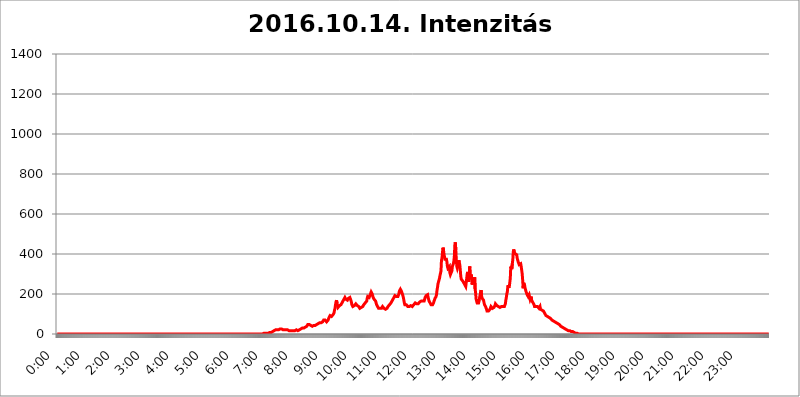
| Category | 2016.10.14. Intenzitás [W/m^2] |
|---|---|
| 0.0 | 0 |
| 0.0006944444444444445 | 0 |
| 0.001388888888888889 | 0 |
| 0.0020833333333333333 | 0 |
| 0.002777777777777778 | 0 |
| 0.003472222222222222 | 0 |
| 0.004166666666666667 | 0 |
| 0.004861111111111111 | 0 |
| 0.005555555555555556 | 0 |
| 0.0062499999999999995 | 0 |
| 0.006944444444444444 | 0 |
| 0.007638888888888889 | 0 |
| 0.008333333333333333 | 0 |
| 0.009027777777777779 | 0 |
| 0.009722222222222222 | 0 |
| 0.010416666666666666 | 0 |
| 0.011111111111111112 | 0 |
| 0.011805555555555555 | 0 |
| 0.012499999999999999 | 0 |
| 0.013194444444444444 | 0 |
| 0.013888888888888888 | 0 |
| 0.014583333333333332 | 0 |
| 0.015277777777777777 | 0 |
| 0.015972222222222224 | 0 |
| 0.016666666666666666 | 0 |
| 0.017361111111111112 | 0 |
| 0.018055555555555557 | 0 |
| 0.01875 | 0 |
| 0.019444444444444445 | 0 |
| 0.02013888888888889 | 0 |
| 0.020833333333333332 | 0 |
| 0.02152777777777778 | 0 |
| 0.022222222222222223 | 0 |
| 0.02291666666666667 | 0 |
| 0.02361111111111111 | 0 |
| 0.024305555555555556 | 0 |
| 0.024999999999999998 | 0 |
| 0.025694444444444447 | 0 |
| 0.02638888888888889 | 0 |
| 0.027083333333333334 | 0 |
| 0.027777777777777776 | 0 |
| 0.02847222222222222 | 0 |
| 0.029166666666666664 | 0 |
| 0.029861111111111113 | 0 |
| 0.030555555555555555 | 0 |
| 0.03125 | 0 |
| 0.03194444444444445 | 0 |
| 0.03263888888888889 | 0 |
| 0.03333333333333333 | 0 |
| 0.034027777777777775 | 0 |
| 0.034722222222222224 | 0 |
| 0.035416666666666666 | 0 |
| 0.036111111111111115 | 0 |
| 0.03680555555555556 | 0 |
| 0.0375 | 0 |
| 0.03819444444444444 | 0 |
| 0.03888888888888889 | 0 |
| 0.03958333333333333 | 0 |
| 0.04027777777777778 | 0 |
| 0.04097222222222222 | 0 |
| 0.041666666666666664 | 0 |
| 0.042361111111111106 | 0 |
| 0.04305555555555556 | 0 |
| 0.043750000000000004 | 0 |
| 0.044444444444444446 | 0 |
| 0.04513888888888889 | 0 |
| 0.04583333333333334 | 0 |
| 0.04652777777777778 | 0 |
| 0.04722222222222222 | 0 |
| 0.04791666666666666 | 0 |
| 0.04861111111111111 | 0 |
| 0.049305555555555554 | 0 |
| 0.049999999999999996 | 0 |
| 0.05069444444444445 | 0 |
| 0.051388888888888894 | 0 |
| 0.052083333333333336 | 0 |
| 0.05277777777777778 | 0 |
| 0.05347222222222222 | 0 |
| 0.05416666666666667 | 0 |
| 0.05486111111111111 | 0 |
| 0.05555555555555555 | 0 |
| 0.05625 | 0 |
| 0.05694444444444444 | 0 |
| 0.057638888888888885 | 0 |
| 0.05833333333333333 | 0 |
| 0.05902777777777778 | 0 |
| 0.059722222222222225 | 0 |
| 0.06041666666666667 | 0 |
| 0.061111111111111116 | 0 |
| 0.06180555555555556 | 0 |
| 0.0625 | 0 |
| 0.06319444444444444 | 0 |
| 0.06388888888888888 | 0 |
| 0.06458333333333334 | 0 |
| 0.06527777777777778 | 0 |
| 0.06597222222222222 | 0 |
| 0.06666666666666667 | 0 |
| 0.06736111111111111 | 0 |
| 0.06805555555555555 | 0 |
| 0.06874999999999999 | 0 |
| 0.06944444444444443 | 0 |
| 0.07013888888888889 | 0 |
| 0.07083333333333333 | 0 |
| 0.07152777777777779 | 0 |
| 0.07222222222222223 | 0 |
| 0.07291666666666667 | 0 |
| 0.07361111111111111 | 0 |
| 0.07430555555555556 | 0 |
| 0.075 | 0 |
| 0.07569444444444444 | 0 |
| 0.0763888888888889 | 0 |
| 0.07708333333333334 | 0 |
| 0.07777777777777778 | 0 |
| 0.07847222222222222 | 0 |
| 0.07916666666666666 | 0 |
| 0.0798611111111111 | 0 |
| 0.08055555555555556 | 0 |
| 0.08125 | 0 |
| 0.08194444444444444 | 0 |
| 0.08263888888888889 | 0 |
| 0.08333333333333333 | 0 |
| 0.08402777777777777 | 0 |
| 0.08472222222222221 | 0 |
| 0.08541666666666665 | 0 |
| 0.08611111111111112 | 0 |
| 0.08680555555555557 | 0 |
| 0.08750000000000001 | 0 |
| 0.08819444444444445 | 0 |
| 0.08888888888888889 | 0 |
| 0.08958333333333333 | 0 |
| 0.09027777777777778 | 0 |
| 0.09097222222222222 | 0 |
| 0.09166666666666667 | 0 |
| 0.09236111111111112 | 0 |
| 0.09305555555555556 | 0 |
| 0.09375 | 0 |
| 0.09444444444444444 | 0 |
| 0.09513888888888888 | 0 |
| 0.09583333333333333 | 0 |
| 0.09652777777777777 | 0 |
| 0.09722222222222222 | 0 |
| 0.09791666666666667 | 0 |
| 0.09861111111111111 | 0 |
| 0.09930555555555555 | 0 |
| 0.09999999999999999 | 0 |
| 0.10069444444444443 | 0 |
| 0.1013888888888889 | 0 |
| 0.10208333333333335 | 0 |
| 0.10277777777777779 | 0 |
| 0.10347222222222223 | 0 |
| 0.10416666666666667 | 0 |
| 0.10486111111111111 | 0 |
| 0.10555555555555556 | 0 |
| 0.10625 | 0 |
| 0.10694444444444444 | 0 |
| 0.1076388888888889 | 0 |
| 0.10833333333333334 | 0 |
| 0.10902777777777778 | 0 |
| 0.10972222222222222 | 0 |
| 0.1111111111111111 | 0 |
| 0.11180555555555556 | 0 |
| 0.11180555555555556 | 0 |
| 0.1125 | 0 |
| 0.11319444444444444 | 0 |
| 0.11388888888888889 | 0 |
| 0.11458333333333333 | 0 |
| 0.11527777777777777 | 0 |
| 0.11597222222222221 | 0 |
| 0.11666666666666665 | 0 |
| 0.1173611111111111 | 0 |
| 0.11805555555555557 | 0 |
| 0.11944444444444445 | 0 |
| 0.12013888888888889 | 0 |
| 0.12083333333333333 | 0 |
| 0.12152777777777778 | 0 |
| 0.12222222222222223 | 0 |
| 0.12291666666666667 | 0 |
| 0.12291666666666667 | 0 |
| 0.12361111111111112 | 0 |
| 0.12430555555555556 | 0 |
| 0.125 | 0 |
| 0.12569444444444444 | 0 |
| 0.12638888888888888 | 0 |
| 0.12708333333333333 | 0 |
| 0.16875 | 0 |
| 0.12847222222222224 | 0 |
| 0.12916666666666668 | 0 |
| 0.12986111111111112 | 0 |
| 0.13055555555555556 | 0 |
| 0.13125 | 0 |
| 0.13194444444444445 | 0 |
| 0.1326388888888889 | 0 |
| 0.13333333333333333 | 0 |
| 0.13402777777777777 | 0 |
| 0.13402777777777777 | 0 |
| 0.13472222222222222 | 0 |
| 0.13541666666666666 | 0 |
| 0.1361111111111111 | 0 |
| 0.13749999999999998 | 0 |
| 0.13819444444444443 | 0 |
| 0.1388888888888889 | 0 |
| 0.13958333333333334 | 0 |
| 0.14027777777777778 | 0 |
| 0.14097222222222222 | 0 |
| 0.14166666666666666 | 0 |
| 0.1423611111111111 | 0 |
| 0.14305555555555557 | 0 |
| 0.14375000000000002 | 0 |
| 0.14444444444444446 | 0 |
| 0.1451388888888889 | 0 |
| 0.1451388888888889 | 0 |
| 0.14652777777777778 | 0 |
| 0.14722222222222223 | 0 |
| 0.14791666666666667 | 0 |
| 0.1486111111111111 | 0 |
| 0.14930555555555555 | 0 |
| 0.15 | 0 |
| 0.15069444444444444 | 0 |
| 0.15138888888888888 | 0 |
| 0.15208333333333332 | 0 |
| 0.15277777777777776 | 0 |
| 0.15347222222222223 | 0 |
| 0.15416666666666667 | 0 |
| 0.15486111111111112 | 0 |
| 0.15555555555555556 | 0 |
| 0.15625 | 0 |
| 0.15694444444444444 | 0 |
| 0.15763888888888888 | 0 |
| 0.15833333333333333 | 0 |
| 0.15902777777777777 | 0 |
| 0.15972222222222224 | 0 |
| 0.16041666666666668 | 0 |
| 0.16111111111111112 | 0 |
| 0.16180555555555556 | 0 |
| 0.1625 | 0 |
| 0.16319444444444445 | 0 |
| 0.1638888888888889 | 0 |
| 0.16458333333333333 | 0 |
| 0.16527777777777777 | 0 |
| 0.16597222222222222 | 0 |
| 0.16666666666666666 | 0 |
| 0.1673611111111111 | 0 |
| 0.16805555555555554 | 0 |
| 0.16874999999999998 | 0 |
| 0.16944444444444443 | 0 |
| 0.17013888888888887 | 0 |
| 0.1708333333333333 | 0 |
| 0.17152777777777775 | 0 |
| 0.17222222222222225 | 0 |
| 0.1729166666666667 | 0 |
| 0.17361111111111113 | 0 |
| 0.17430555555555557 | 0 |
| 0.17500000000000002 | 0 |
| 0.17569444444444446 | 0 |
| 0.1763888888888889 | 0 |
| 0.17708333333333334 | 0 |
| 0.17777777777777778 | 0 |
| 0.17847222222222223 | 0 |
| 0.17916666666666667 | 0 |
| 0.1798611111111111 | 0 |
| 0.18055555555555555 | 0 |
| 0.18125 | 0 |
| 0.18194444444444444 | 0 |
| 0.1826388888888889 | 0 |
| 0.18333333333333335 | 0 |
| 0.1840277777777778 | 0 |
| 0.18472222222222223 | 0 |
| 0.18541666666666667 | 0 |
| 0.18611111111111112 | 0 |
| 0.18680555555555556 | 0 |
| 0.1875 | 0 |
| 0.18819444444444444 | 0 |
| 0.18888888888888888 | 0 |
| 0.18958333333333333 | 0 |
| 0.19027777777777777 | 0 |
| 0.1909722222222222 | 0 |
| 0.19166666666666665 | 0 |
| 0.19236111111111112 | 0 |
| 0.19305555555555554 | 0 |
| 0.19375 | 0 |
| 0.19444444444444445 | 0 |
| 0.1951388888888889 | 0 |
| 0.19583333333333333 | 0 |
| 0.19652777777777777 | 0 |
| 0.19722222222222222 | 0 |
| 0.19791666666666666 | 0 |
| 0.1986111111111111 | 0 |
| 0.19930555555555554 | 0 |
| 0.19999999999999998 | 0 |
| 0.20069444444444443 | 0 |
| 0.20138888888888887 | 0 |
| 0.2020833333333333 | 0 |
| 0.2027777777777778 | 0 |
| 0.2034722222222222 | 0 |
| 0.2041666666666667 | 0 |
| 0.20486111111111113 | 0 |
| 0.20555555555555557 | 0 |
| 0.20625000000000002 | 0 |
| 0.20694444444444446 | 0 |
| 0.2076388888888889 | 0 |
| 0.20833333333333334 | 0 |
| 0.20902777777777778 | 0 |
| 0.20972222222222223 | 0 |
| 0.21041666666666667 | 0 |
| 0.2111111111111111 | 0 |
| 0.21180555555555555 | 0 |
| 0.2125 | 0 |
| 0.21319444444444444 | 0 |
| 0.2138888888888889 | 0 |
| 0.21458333333333335 | 0 |
| 0.2152777777777778 | 0 |
| 0.21597222222222223 | 0 |
| 0.21666666666666667 | 0 |
| 0.21736111111111112 | 0 |
| 0.21805555555555556 | 0 |
| 0.21875 | 0 |
| 0.21944444444444444 | 0 |
| 0.22013888888888888 | 0 |
| 0.22083333333333333 | 0 |
| 0.22152777777777777 | 0 |
| 0.2222222222222222 | 0 |
| 0.22291666666666665 | 0 |
| 0.2236111111111111 | 0 |
| 0.22430555555555556 | 0 |
| 0.225 | 0 |
| 0.22569444444444445 | 0 |
| 0.2263888888888889 | 0 |
| 0.22708333333333333 | 0 |
| 0.22777777777777777 | 0 |
| 0.22847222222222222 | 0 |
| 0.22916666666666666 | 0 |
| 0.2298611111111111 | 0 |
| 0.23055555555555554 | 0 |
| 0.23124999999999998 | 0 |
| 0.23194444444444443 | 0 |
| 0.23263888888888887 | 0 |
| 0.2333333333333333 | 0 |
| 0.2340277777777778 | 0 |
| 0.2347222222222222 | 0 |
| 0.2354166666666667 | 0 |
| 0.23611111111111113 | 0 |
| 0.23680555555555557 | 0 |
| 0.23750000000000002 | 0 |
| 0.23819444444444446 | 0 |
| 0.2388888888888889 | 0 |
| 0.23958333333333334 | 0 |
| 0.24027777777777778 | 0 |
| 0.24097222222222223 | 0 |
| 0.24166666666666667 | 0 |
| 0.2423611111111111 | 0 |
| 0.24305555555555555 | 0 |
| 0.24375 | 0 |
| 0.24444444444444446 | 0 |
| 0.24513888888888888 | 0 |
| 0.24583333333333335 | 0 |
| 0.2465277777777778 | 0 |
| 0.24722222222222223 | 0 |
| 0.24791666666666667 | 0 |
| 0.24861111111111112 | 0 |
| 0.24930555555555556 | 0 |
| 0.25 | 0 |
| 0.25069444444444444 | 0 |
| 0.2513888888888889 | 0 |
| 0.2520833333333333 | 0 |
| 0.25277777777777777 | 0 |
| 0.2534722222222222 | 0 |
| 0.25416666666666665 | 0 |
| 0.2548611111111111 | 0 |
| 0.2555555555555556 | 0 |
| 0.25625000000000003 | 0 |
| 0.2569444444444445 | 0 |
| 0.2576388888888889 | 0 |
| 0.25833333333333336 | 0 |
| 0.2590277777777778 | 0 |
| 0.25972222222222224 | 0 |
| 0.2604166666666667 | 0 |
| 0.2611111111111111 | 0 |
| 0.26180555555555557 | 0 |
| 0.2625 | 0 |
| 0.26319444444444445 | 0 |
| 0.2638888888888889 | 0 |
| 0.26458333333333334 | 0 |
| 0.2652777777777778 | 0 |
| 0.2659722222222222 | 0 |
| 0.26666666666666666 | 0 |
| 0.2673611111111111 | 0 |
| 0.26805555555555555 | 0 |
| 0.26875 | 0 |
| 0.26944444444444443 | 0 |
| 0.2701388888888889 | 0 |
| 0.2708333333333333 | 0 |
| 0.27152777777777776 | 0 |
| 0.2722222222222222 | 0 |
| 0.27291666666666664 | 0 |
| 0.2736111111111111 | 0 |
| 0.2743055555555555 | 0 |
| 0.27499999999999997 | 0 |
| 0.27569444444444446 | 0 |
| 0.27638888888888885 | 0 |
| 0.27708333333333335 | 0 |
| 0.2777777777777778 | 0 |
| 0.27847222222222223 | 0 |
| 0.2791666666666667 | 0 |
| 0.2798611111111111 | 0 |
| 0.28055555555555556 | 0 |
| 0.28125 | 0 |
| 0.28194444444444444 | 0 |
| 0.2826388888888889 | 0 |
| 0.2833333333333333 | 0 |
| 0.28402777777777777 | 0 |
| 0.2847222222222222 | 0 |
| 0.28541666666666665 | 0 |
| 0.28611111111111115 | 0 |
| 0.28680555555555554 | 0 |
| 0.28750000000000003 | 0 |
| 0.2881944444444445 | 0 |
| 0.2888888888888889 | 0 |
| 0.28958333333333336 | 3.525 |
| 0.2902777777777778 | 3.525 |
| 0.29097222222222224 | 3.525 |
| 0.2916666666666667 | 3.525 |
| 0.2923611111111111 | 3.525 |
| 0.29305555555555557 | 3.525 |
| 0.29375 | 3.525 |
| 0.29444444444444445 | 3.525 |
| 0.2951388888888889 | 3.525 |
| 0.29583333333333334 | 3.525 |
| 0.2965277777777778 | 7.887 |
| 0.2972222222222222 | 7.887 |
| 0.29791666666666666 | 7.887 |
| 0.2986111111111111 | 7.887 |
| 0.29930555555555555 | 7.887 |
| 0.3 | 7.887 |
| 0.30069444444444443 | 12.257 |
| 0.3013888888888889 | 12.257 |
| 0.3020833333333333 | 12.257 |
| 0.30277777777777776 | 12.257 |
| 0.3034722222222222 | 16.636 |
| 0.30416666666666664 | 16.636 |
| 0.3048611111111111 | 16.636 |
| 0.3055555555555555 | 16.636 |
| 0.30624999999999997 | 21.024 |
| 0.3069444444444444 | 21.024 |
| 0.3076388888888889 | 21.024 |
| 0.30833333333333335 | 21.024 |
| 0.3090277777777778 | 21.024 |
| 0.30972222222222223 | 21.024 |
| 0.3104166666666667 | 21.024 |
| 0.3111111111111111 | 21.024 |
| 0.31180555555555556 | 25.419 |
| 0.3125 | 25.419 |
| 0.31319444444444444 | 25.419 |
| 0.3138888888888889 | 25.419 |
| 0.3145833333333333 | 25.419 |
| 0.31527777777777777 | 21.024 |
| 0.3159722222222222 | 21.024 |
| 0.31666666666666665 | 21.024 |
| 0.31736111111111115 | 21.024 |
| 0.31805555555555554 | 21.024 |
| 0.31875000000000003 | 21.024 |
| 0.3194444444444445 | 21.024 |
| 0.3201388888888889 | 21.024 |
| 0.32083333333333336 | 21.024 |
| 0.3215277777777778 | 21.024 |
| 0.32222222222222224 | 21.024 |
| 0.3229166666666667 | 21.024 |
| 0.3236111111111111 | 16.636 |
| 0.32430555555555557 | 16.636 |
| 0.325 | 16.636 |
| 0.32569444444444445 | 21.024 |
| 0.3263888888888889 | 21.024 |
| 0.32708333333333334 | 16.636 |
| 0.3277777777777778 | 16.636 |
| 0.3284722222222222 | 16.636 |
| 0.32916666666666666 | 16.636 |
| 0.3298611111111111 | 16.636 |
| 0.33055555555555555 | 16.636 |
| 0.33125 | 16.636 |
| 0.33194444444444443 | 16.636 |
| 0.3326388888888889 | 16.636 |
| 0.3333333333333333 | 16.636 |
| 0.3340277777777778 | 16.636 |
| 0.3347222222222222 | 16.636 |
| 0.3354166666666667 | 21.024 |
| 0.3361111111111111 | 21.024 |
| 0.3368055555555556 | 21.024 |
| 0.33749999999999997 | 16.636 |
| 0.33819444444444446 | 21.024 |
| 0.33888888888888885 | 21.024 |
| 0.33958333333333335 | 21.024 |
| 0.34027777777777773 | 25.419 |
| 0.34097222222222223 | 25.419 |
| 0.3416666666666666 | 25.419 |
| 0.3423611111111111 | 29.823 |
| 0.3430555555555555 | 29.823 |
| 0.34375 | 29.823 |
| 0.3444444444444445 | 29.823 |
| 0.3451388888888889 | 29.823 |
| 0.3458333333333334 | 29.823 |
| 0.34652777777777777 | 34.234 |
| 0.34722222222222227 | 34.234 |
| 0.34791666666666665 | 34.234 |
| 0.34861111111111115 | 38.653 |
| 0.34930555555555554 | 38.653 |
| 0.35000000000000003 | 38.653 |
| 0.3506944444444444 | 43.079 |
| 0.3513888888888889 | 47.511 |
| 0.3520833333333333 | 47.511 |
| 0.3527777777777778 | 47.511 |
| 0.3534722222222222 | 47.511 |
| 0.3541666666666667 | 47.511 |
| 0.3548611111111111 | 43.079 |
| 0.35555555555555557 | 43.079 |
| 0.35625 | 43.079 |
| 0.35694444444444445 | 38.653 |
| 0.3576388888888889 | 38.653 |
| 0.35833333333333334 | 38.653 |
| 0.3590277777777778 | 38.653 |
| 0.3597222222222222 | 43.079 |
| 0.36041666666666666 | 43.079 |
| 0.3611111111111111 | 43.079 |
| 0.36180555555555555 | 43.079 |
| 0.3625 | 43.079 |
| 0.36319444444444443 | 47.511 |
| 0.3638888888888889 | 47.511 |
| 0.3645833333333333 | 47.511 |
| 0.3652777777777778 | 51.951 |
| 0.3659722222222222 | 51.951 |
| 0.3666666666666667 | 51.951 |
| 0.3673611111111111 | 56.398 |
| 0.3680555555555556 | 56.398 |
| 0.36874999999999997 | 56.398 |
| 0.36944444444444446 | 56.398 |
| 0.37013888888888885 | 56.398 |
| 0.37083333333333335 | 56.398 |
| 0.37152777777777773 | 56.398 |
| 0.37222222222222223 | 60.85 |
| 0.3729166666666666 | 65.31 |
| 0.3736111111111111 | 69.775 |
| 0.3743055555555555 | 74.246 |
| 0.375 | 74.246 |
| 0.3756944444444445 | 69.775 |
| 0.3763888888888889 | 65.31 |
| 0.3770833333333334 | 65.31 |
| 0.37777777777777777 | 60.85 |
| 0.37847222222222227 | 60.85 |
| 0.37916666666666665 | 65.31 |
| 0.37986111111111115 | 69.775 |
| 0.38055555555555554 | 74.246 |
| 0.38125000000000003 | 83.205 |
| 0.3819444444444444 | 87.692 |
| 0.3826388888888889 | 92.184 |
| 0.3833333333333333 | 92.184 |
| 0.3840277777777778 | 87.692 |
| 0.3847222222222222 | 87.692 |
| 0.3854166666666667 | 87.692 |
| 0.3861111111111111 | 92.184 |
| 0.38680555555555557 | 96.682 |
| 0.3875 | 101.184 |
| 0.38819444444444445 | 105.69 |
| 0.3888888888888889 | 119.235 |
| 0.38958333333333334 | 128.284 |
| 0.3902777777777778 | 146.423 |
| 0.3909722222222222 | 160.056 |
| 0.39166666666666666 | 169.156 |
| 0.3923611111111111 | 155.509 |
| 0.39305555555555555 | 141.884 |
| 0.39375 | 132.814 |
| 0.39444444444444443 | 132.814 |
| 0.3951388888888889 | 132.814 |
| 0.3958333333333333 | 141.884 |
| 0.3965277777777778 | 146.423 |
| 0.3972222222222222 | 146.423 |
| 0.3979166666666667 | 146.423 |
| 0.3986111111111111 | 146.423 |
| 0.3993055555555556 | 155.509 |
| 0.39999999999999997 | 155.509 |
| 0.40069444444444446 | 164.605 |
| 0.40138888888888885 | 169.156 |
| 0.40208333333333335 | 173.709 |
| 0.40277777777777773 | 178.264 |
| 0.40347222222222223 | 182.82 |
| 0.4041666666666666 | 178.264 |
| 0.4048611111111111 | 173.709 |
| 0.4055555555555555 | 169.156 |
| 0.40625 | 169.156 |
| 0.4069444444444445 | 169.156 |
| 0.4076388888888889 | 173.709 |
| 0.4083333333333334 | 178.264 |
| 0.40902777777777777 | 182.82 |
| 0.40972222222222227 | 182.82 |
| 0.41041666666666665 | 182.82 |
| 0.41111111111111115 | 182.82 |
| 0.41180555555555554 | 169.156 |
| 0.41250000000000003 | 160.056 |
| 0.4131944444444444 | 146.423 |
| 0.4138888888888889 | 141.884 |
| 0.4145833333333333 | 137.347 |
| 0.4152777777777778 | 137.347 |
| 0.4159722222222222 | 137.347 |
| 0.4166666666666667 | 141.884 |
| 0.4173611111111111 | 146.423 |
| 0.41805555555555557 | 146.423 |
| 0.41875 | 150.964 |
| 0.41944444444444445 | 150.964 |
| 0.4201388888888889 | 146.423 |
| 0.42083333333333334 | 141.884 |
| 0.4215277777777778 | 141.884 |
| 0.4222222222222222 | 137.347 |
| 0.42291666666666666 | 137.347 |
| 0.4236111111111111 | 132.814 |
| 0.42430555555555555 | 128.284 |
| 0.425 | 128.284 |
| 0.42569444444444443 | 128.284 |
| 0.4263888888888889 | 132.814 |
| 0.4270833333333333 | 132.814 |
| 0.4277777777777778 | 137.347 |
| 0.4284722222222222 | 137.347 |
| 0.4291666666666667 | 141.884 |
| 0.4298611111111111 | 146.423 |
| 0.4305555555555556 | 150.964 |
| 0.43124999999999997 | 150.964 |
| 0.43194444444444446 | 155.509 |
| 0.43263888888888885 | 155.509 |
| 0.43333333333333335 | 160.056 |
| 0.43402777777777773 | 164.605 |
| 0.43472222222222223 | 178.264 |
| 0.4354166666666666 | 187.378 |
| 0.4361111111111111 | 182.82 |
| 0.4368055555555555 | 182.82 |
| 0.4375 | 182.82 |
| 0.4381944444444445 | 187.378 |
| 0.4388888888888889 | 196.497 |
| 0.4395833333333334 | 201.058 |
| 0.44027777777777777 | 210.182 |
| 0.44097222222222227 | 210.182 |
| 0.44166666666666665 | 201.058 |
| 0.44236111111111115 | 191.937 |
| 0.44305555555555554 | 182.82 |
| 0.44375000000000003 | 178.264 |
| 0.4444444444444444 | 173.709 |
| 0.4451388888888889 | 173.709 |
| 0.4458333333333333 | 169.156 |
| 0.4465277777777778 | 164.605 |
| 0.4472222222222222 | 155.509 |
| 0.4479166666666667 | 146.423 |
| 0.4486111111111111 | 141.884 |
| 0.44930555555555557 | 137.347 |
| 0.45 | 132.814 |
| 0.45069444444444445 | 128.284 |
| 0.4513888888888889 | 128.284 |
| 0.45208333333333334 | 128.284 |
| 0.4527777777777778 | 128.284 |
| 0.4534722222222222 | 123.758 |
| 0.45416666666666666 | 123.758 |
| 0.4548611111111111 | 128.284 |
| 0.45555555555555555 | 132.814 |
| 0.45625 | 137.347 |
| 0.45694444444444443 | 132.814 |
| 0.4576388888888889 | 132.814 |
| 0.4583333333333333 | 128.284 |
| 0.4590277777777778 | 128.284 |
| 0.4597222222222222 | 123.758 |
| 0.4604166666666667 | 123.758 |
| 0.4611111111111111 | 123.758 |
| 0.4618055555555556 | 128.284 |
| 0.46249999999999997 | 128.284 |
| 0.46319444444444446 | 132.814 |
| 0.46388888888888885 | 137.347 |
| 0.46458333333333335 | 137.347 |
| 0.46527777777777773 | 141.884 |
| 0.46597222222222223 | 146.423 |
| 0.4666666666666666 | 146.423 |
| 0.4673611111111111 | 150.964 |
| 0.4680555555555555 | 155.509 |
| 0.46875 | 155.509 |
| 0.4694444444444445 | 164.605 |
| 0.4701388888888889 | 169.156 |
| 0.4708333333333334 | 173.709 |
| 0.47152777777777777 | 173.709 |
| 0.47222222222222227 | 182.82 |
| 0.47291666666666665 | 187.378 |
| 0.47361111111111115 | 191.937 |
| 0.47430555555555554 | 191.937 |
| 0.47500000000000003 | 191.937 |
| 0.4756944444444444 | 187.378 |
| 0.4763888888888889 | 187.378 |
| 0.4770833333333333 | 187.378 |
| 0.4777777777777778 | 187.378 |
| 0.4784722222222222 | 191.937 |
| 0.4791666666666667 | 201.058 |
| 0.4798611111111111 | 214.746 |
| 0.48055555555555557 | 219.309 |
| 0.48125 | 223.873 |
| 0.48194444444444445 | 219.309 |
| 0.4826388888888889 | 214.746 |
| 0.48333333333333334 | 210.182 |
| 0.4840277777777778 | 201.058 |
| 0.4847222222222222 | 191.937 |
| 0.48541666666666666 | 182.82 |
| 0.4861111111111111 | 169.156 |
| 0.48680555555555555 | 155.509 |
| 0.4875 | 146.423 |
| 0.48819444444444443 | 146.423 |
| 0.4888888888888889 | 146.423 |
| 0.4895833333333333 | 146.423 |
| 0.4902777777777778 | 146.423 |
| 0.4909722222222222 | 141.884 |
| 0.4916666666666667 | 137.347 |
| 0.4923611111111111 | 137.347 |
| 0.4930555555555556 | 137.347 |
| 0.49374999999999997 | 137.347 |
| 0.49444444444444446 | 141.884 |
| 0.49513888888888885 | 141.884 |
| 0.49583333333333335 | 141.884 |
| 0.49652777777777773 | 141.884 |
| 0.49722222222222223 | 137.347 |
| 0.4979166666666666 | 137.347 |
| 0.4986111111111111 | 137.347 |
| 0.4993055555555555 | 141.884 |
| 0.5 | 146.423 |
| 0.5006944444444444 | 146.423 |
| 0.5013888888888889 | 150.964 |
| 0.5020833333333333 | 155.509 |
| 0.5027777777777778 | 155.509 |
| 0.5034722222222222 | 155.509 |
| 0.5041666666666667 | 150.964 |
| 0.5048611111111111 | 150.964 |
| 0.5055555555555555 | 150.964 |
| 0.50625 | 150.964 |
| 0.5069444444444444 | 155.509 |
| 0.5076388888888889 | 155.509 |
| 0.5083333333333333 | 160.056 |
| 0.5090277777777777 | 160.056 |
| 0.5097222222222222 | 164.605 |
| 0.5104166666666666 | 164.605 |
| 0.5111111111111112 | 164.605 |
| 0.5118055555555555 | 164.605 |
| 0.5125000000000001 | 164.605 |
| 0.5131944444444444 | 160.056 |
| 0.513888888888889 | 164.605 |
| 0.5145833333333333 | 164.605 |
| 0.5152777777777778 | 173.709 |
| 0.5159722222222222 | 182.82 |
| 0.5166666666666667 | 187.378 |
| 0.517361111111111 | 191.937 |
| 0.5180555555555556 | 196.497 |
| 0.5187499999999999 | 196.497 |
| 0.5194444444444445 | 196.497 |
| 0.5201388888888888 | 182.82 |
| 0.5208333333333334 | 173.709 |
| 0.5215277777777778 | 164.605 |
| 0.5222222222222223 | 160.056 |
| 0.5229166666666667 | 155.509 |
| 0.5236111111111111 | 150.964 |
| 0.5243055555555556 | 146.423 |
| 0.525 | 141.884 |
| 0.5256944444444445 | 146.423 |
| 0.5263888888888889 | 146.423 |
| 0.5270833333333333 | 150.964 |
| 0.5277777777777778 | 155.509 |
| 0.5284722222222222 | 164.605 |
| 0.5291666666666667 | 169.156 |
| 0.5298611111111111 | 178.264 |
| 0.5305555555555556 | 182.82 |
| 0.53125 | 187.378 |
| 0.5319444444444444 | 196.497 |
| 0.5326388888888889 | 219.309 |
| 0.5333333333333333 | 233 |
| 0.5340277777777778 | 251.251 |
| 0.5347222222222222 | 260.373 |
| 0.5354166666666667 | 264.932 |
| 0.5361111111111111 | 278.603 |
| 0.5368055555555555 | 292.259 |
| 0.5375 | 296.808 |
| 0.5381944444444444 | 314.98 |
| 0.5388888888888889 | 369.23 |
| 0.5395833333333333 | 378.224 |
| 0.5402777777777777 | 405.108 |
| 0.5409722222222222 | 431.833 |
| 0.5416666666666666 | 422.943 |
| 0.5423611111111112 | 400.638 |
| 0.5430555555555555 | 387.202 |
| 0.5437500000000001 | 373.729 |
| 0.5444444444444444 | 373.729 |
| 0.545138888888889 | 378.224 |
| 0.5458333333333333 | 373.729 |
| 0.5465277777777778 | 360.221 |
| 0.5472222222222222 | 337.639 |
| 0.5479166666666667 | 328.584 |
| 0.548611111111111 | 324.052 |
| 0.5493055555555556 | 328.584 |
| 0.5499999999999999 | 337.639 |
| 0.5506944444444445 | 305.898 |
| 0.5513888888888888 | 296.808 |
| 0.5520833333333334 | 296.808 |
| 0.5527777777777778 | 301.354 |
| 0.5534722222222223 | 314.98 |
| 0.5541666666666667 | 337.639 |
| 0.5548611111111111 | 342.162 |
| 0.5555555555555556 | 351.198 |
| 0.55625 | 364.728 |
| 0.5569444444444445 | 387.202 |
| 0.5576388888888889 | 445.129 |
| 0.5583333333333333 | 458.38 |
| 0.5590277777777778 | 418.492 |
| 0.5597222222222222 | 369.23 |
| 0.5604166666666667 | 337.639 |
| 0.5611111111111111 | 328.584 |
| 0.5618055555555556 | 333.113 |
| 0.5625 | 346.682 |
| 0.5631944444444444 | 369.23 |
| 0.5638888888888889 | 355.712 |
| 0.5645833333333333 | 346.682 |
| 0.5652777777777778 | 319.517 |
| 0.5659722222222222 | 287.709 |
| 0.5666666666666667 | 274.047 |
| 0.5673611111111111 | 269.49 |
| 0.5680555555555555 | 269.49 |
| 0.56875 | 264.932 |
| 0.5694444444444444 | 260.373 |
| 0.5701388888888889 | 255.813 |
| 0.5708333333333333 | 251.251 |
| 0.5715277777777777 | 246.689 |
| 0.5722222222222222 | 242.127 |
| 0.5729166666666666 | 237.564 |
| 0.5736111111111112 | 242.127 |
| 0.5743055555555555 | 278.603 |
| 0.5750000000000001 | 301.354 |
| 0.5756944444444444 | 310.44 |
| 0.576388888888889 | 296.808 |
| 0.5770833333333333 | 260.373 |
| 0.5777777777777778 | 260.373 |
| 0.5784722222222222 | 337.639 |
| 0.5791666666666667 | 292.259 |
| 0.579861111111111 | 274.047 |
| 0.5805555555555556 | 296.808 |
| 0.5812499999999999 | 283.156 |
| 0.5819444444444445 | 246.689 |
| 0.5826388888888888 | 264.932 |
| 0.5833333333333334 | 255.813 |
| 0.5840277777777778 | 278.603 |
| 0.5847222222222223 | 269.49 |
| 0.5854166666666667 | 283.156 |
| 0.5861111111111111 | 223.873 |
| 0.5868055555555556 | 205.62 |
| 0.5875 | 173.709 |
| 0.5881944444444445 | 164.605 |
| 0.5888888888888889 | 155.509 |
| 0.5895833333333333 | 155.509 |
| 0.5902777777777778 | 155.509 |
| 0.5909722222222222 | 155.509 |
| 0.5916666666666667 | 164.605 |
| 0.5923611111111111 | 182.82 |
| 0.5930555555555556 | 196.497 |
| 0.59375 | 201.058 |
| 0.5944444444444444 | 219.309 |
| 0.5951388888888889 | 191.937 |
| 0.5958333333333333 | 178.264 |
| 0.5965277777777778 | 182.82 |
| 0.5972222222222222 | 182.82 |
| 0.5979166666666667 | 169.156 |
| 0.5986111111111111 | 155.509 |
| 0.5993055555555555 | 146.423 |
| 0.6 | 141.884 |
| 0.6006944444444444 | 137.347 |
| 0.6013888888888889 | 132.814 |
| 0.6020833333333333 | 123.758 |
| 0.6027777777777777 | 114.716 |
| 0.6034722222222222 | 110.201 |
| 0.6041666666666666 | 110.201 |
| 0.6048611111111112 | 114.716 |
| 0.6055555555555555 | 119.235 |
| 0.6062500000000001 | 119.235 |
| 0.6069444444444444 | 123.758 |
| 0.607638888888889 | 128.284 |
| 0.6083333333333333 | 137.347 |
| 0.6090277777777778 | 132.814 |
| 0.6097222222222222 | 132.814 |
| 0.6104166666666667 | 128.284 |
| 0.611111111111111 | 128.284 |
| 0.6118055555555556 | 128.284 |
| 0.6124999999999999 | 132.814 |
| 0.6131944444444445 | 137.347 |
| 0.6138888888888888 | 141.884 |
| 0.6145833333333334 | 150.964 |
| 0.6152777777777778 | 150.964 |
| 0.6159722222222223 | 146.423 |
| 0.6166666666666667 | 141.884 |
| 0.6173611111111111 | 141.884 |
| 0.6180555555555556 | 137.347 |
| 0.61875 | 137.347 |
| 0.6194444444444445 | 132.814 |
| 0.6201388888888889 | 132.814 |
| 0.6208333333333333 | 132.814 |
| 0.6215277777777778 | 137.347 |
| 0.6222222222222222 | 137.347 |
| 0.6229166666666667 | 137.347 |
| 0.6236111111111111 | 137.347 |
| 0.6243055555555556 | 137.347 |
| 0.625 | 137.347 |
| 0.6256944444444444 | 137.347 |
| 0.6263888888888889 | 137.347 |
| 0.6270833333333333 | 137.347 |
| 0.6277777777777778 | 141.884 |
| 0.6284722222222222 | 150.964 |
| 0.6291666666666667 | 169.156 |
| 0.6298611111111111 | 182.82 |
| 0.6305555555555555 | 201.058 |
| 0.63125 | 210.182 |
| 0.6319444444444444 | 237.564 |
| 0.6326388888888889 | 237.564 |
| 0.6333333333333333 | 242.127 |
| 0.6340277777777777 | 237.564 |
| 0.6347222222222222 | 242.127 |
| 0.6354166666666666 | 278.603 |
| 0.6361111111111112 | 337.639 |
| 0.6368055555555555 | 337.639 |
| 0.6375000000000001 | 324.052 |
| 0.6381944444444444 | 351.198 |
| 0.638888888888889 | 369.23 |
| 0.6395833333333333 | 409.574 |
| 0.6402777777777778 | 422.943 |
| 0.6409722222222222 | 409.574 |
| 0.6416666666666667 | 405.108 |
| 0.642361111111111 | 400.638 |
| 0.6430555555555556 | 400.638 |
| 0.6437499999999999 | 405.108 |
| 0.6444444444444445 | 396.164 |
| 0.6451388888888888 | 378.224 |
| 0.6458333333333334 | 378.224 |
| 0.6465277777777778 | 360.221 |
| 0.6472222222222223 | 355.712 |
| 0.6479166666666667 | 346.682 |
| 0.6486111111111111 | 351.198 |
| 0.6493055555555556 | 351.198 |
| 0.65 | 351.198 |
| 0.6506944444444445 | 337.639 |
| 0.6513888888888889 | 333.113 |
| 0.6520833333333333 | 301.354 |
| 0.6527777777777778 | 269.49 |
| 0.6534722222222222 | 228.436 |
| 0.6541666666666667 | 255.813 |
| 0.6548611111111111 | 251.251 |
| 0.6555555555555556 | 242.127 |
| 0.65625 | 228.436 |
| 0.6569444444444444 | 223.873 |
| 0.6576388888888889 | 210.182 |
| 0.6583333333333333 | 210.182 |
| 0.6590277777777778 | 196.497 |
| 0.6597222222222222 | 191.937 |
| 0.6604166666666667 | 187.378 |
| 0.6611111111111111 | 191.937 |
| 0.6618055555555555 | 196.497 |
| 0.6625 | 191.937 |
| 0.6631944444444444 | 173.709 |
| 0.6638888888888889 | 178.264 |
| 0.6645833333333333 | 187.378 |
| 0.6652777777777777 | 169.156 |
| 0.6659722222222222 | 173.709 |
| 0.6666666666666666 | 169.156 |
| 0.6673611111111111 | 155.509 |
| 0.6680555555555556 | 150.964 |
| 0.6687500000000001 | 146.423 |
| 0.6694444444444444 | 137.347 |
| 0.6701388888888888 | 137.347 |
| 0.6708333333333334 | 137.347 |
| 0.6715277777777778 | 137.347 |
| 0.6722222222222222 | 137.347 |
| 0.6729166666666666 | 137.347 |
| 0.6736111111111112 | 137.347 |
| 0.6743055555555556 | 132.814 |
| 0.6749999999999999 | 137.347 |
| 0.6756944444444444 | 128.284 |
| 0.6763888888888889 | 132.814 |
| 0.6770833333333334 | 137.347 |
| 0.6777777777777777 | 123.758 |
| 0.6784722222222223 | 123.758 |
| 0.6791666666666667 | 119.235 |
| 0.6798611111111111 | 119.235 |
| 0.6805555555555555 | 114.716 |
| 0.68125 | 119.235 |
| 0.6819444444444445 | 114.716 |
| 0.6826388888888889 | 110.201 |
| 0.6833333333333332 | 105.69 |
| 0.6840277777777778 | 105.69 |
| 0.6847222222222222 | 101.184 |
| 0.6854166666666667 | 92.184 |
| 0.686111111111111 | 87.692 |
| 0.6868055555555556 | 87.692 |
| 0.6875 | 87.692 |
| 0.6881944444444444 | 83.205 |
| 0.688888888888889 | 83.205 |
| 0.6895833333333333 | 83.205 |
| 0.6902777777777778 | 83.205 |
| 0.6909722222222222 | 78.722 |
| 0.6916666666666668 | 78.722 |
| 0.6923611111111111 | 74.246 |
| 0.6930555555555555 | 74.246 |
| 0.69375 | 69.775 |
| 0.6944444444444445 | 69.775 |
| 0.6951388888888889 | 65.31 |
| 0.6958333333333333 | 65.31 |
| 0.6965277777777777 | 65.31 |
| 0.6972222222222223 | 60.85 |
| 0.6979166666666666 | 60.85 |
| 0.6986111111111111 | 60.85 |
| 0.6993055555555556 | 56.398 |
| 0.7000000000000001 | 56.398 |
| 0.7006944444444444 | 56.398 |
| 0.7013888888888888 | 56.398 |
| 0.7020833333333334 | 51.951 |
| 0.7027777777777778 | 51.951 |
| 0.7034722222222222 | 51.951 |
| 0.7041666666666666 | 47.511 |
| 0.7048611111111112 | 43.079 |
| 0.7055555555555556 | 43.079 |
| 0.7062499999999999 | 38.653 |
| 0.7069444444444444 | 38.653 |
| 0.7076388888888889 | 34.234 |
| 0.7083333333333334 | 34.234 |
| 0.7090277777777777 | 34.234 |
| 0.7097222222222223 | 29.823 |
| 0.7104166666666667 | 29.823 |
| 0.7111111111111111 | 25.419 |
| 0.7118055555555555 | 25.419 |
| 0.7125 | 25.419 |
| 0.7131944444444445 | 21.024 |
| 0.7138888888888889 | 21.024 |
| 0.7145833333333332 | 21.024 |
| 0.7152777777777778 | 21.024 |
| 0.7159722222222222 | 21.024 |
| 0.7166666666666667 | 16.636 |
| 0.717361111111111 | 16.636 |
| 0.7180555555555556 | 16.636 |
| 0.71875 | 16.636 |
| 0.7194444444444444 | 12.257 |
| 0.720138888888889 | 12.257 |
| 0.7208333333333333 | 12.257 |
| 0.7215277777777778 | 12.257 |
| 0.7222222222222222 | 12.257 |
| 0.7229166666666668 | 12.257 |
| 0.7236111111111111 | 7.887 |
| 0.7243055555555555 | 7.887 |
| 0.725 | 7.887 |
| 0.7256944444444445 | 3.525 |
| 0.7263888888888889 | 3.525 |
| 0.7270833333333333 | 3.525 |
| 0.7277777777777777 | 3.525 |
| 0.7284722222222223 | 3.525 |
| 0.7291666666666666 | 3.525 |
| 0.7298611111111111 | 3.525 |
| 0.7305555555555556 | 0 |
| 0.7312500000000001 | 0 |
| 0.7319444444444444 | 0 |
| 0.7326388888888888 | 0 |
| 0.7333333333333334 | 0 |
| 0.7340277777777778 | 0 |
| 0.7347222222222222 | 0 |
| 0.7354166666666666 | 0 |
| 0.7361111111111112 | 0 |
| 0.7368055555555556 | 0 |
| 0.7374999999999999 | 0 |
| 0.7381944444444444 | 0 |
| 0.7388888888888889 | 0 |
| 0.7395833333333334 | 0 |
| 0.7402777777777777 | 0 |
| 0.7409722222222223 | 0 |
| 0.7416666666666667 | 0 |
| 0.7423611111111111 | 0 |
| 0.7430555555555555 | 0 |
| 0.74375 | 0 |
| 0.7444444444444445 | 0 |
| 0.7451388888888889 | 0 |
| 0.7458333333333332 | 0 |
| 0.7465277777777778 | 0 |
| 0.7472222222222222 | 0 |
| 0.7479166666666667 | 0 |
| 0.748611111111111 | 0 |
| 0.7493055555555556 | 0 |
| 0.75 | 0 |
| 0.7506944444444444 | 0 |
| 0.751388888888889 | 0 |
| 0.7520833333333333 | 0 |
| 0.7527777777777778 | 0 |
| 0.7534722222222222 | 0 |
| 0.7541666666666668 | 0 |
| 0.7548611111111111 | 0 |
| 0.7555555555555555 | 0 |
| 0.75625 | 0 |
| 0.7569444444444445 | 0 |
| 0.7576388888888889 | 0 |
| 0.7583333333333333 | 0 |
| 0.7590277777777777 | 0 |
| 0.7597222222222223 | 0 |
| 0.7604166666666666 | 0 |
| 0.7611111111111111 | 0 |
| 0.7618055555555556 | 0 |
| 0.7625000000000001 | 0 |
| 0.7631944444444444 | 0 |
| 0.7638888888888888 | 0 |
| 0.7645833333333334 | 0 |
| 0.7652777777777778 | 0 |
| 0.7659722222222222 | 0 |
| 0.7666666666666666 | 0 |
| 0.7673611111111112 | 0 |
| 0.7680555555555556 | 0 |
| 0.7687499999999999 | 0 |
| 0.7694444444444444 | 0 |
| 0.7701388888888889 | 0 |
| 0.7708333333333334 | 0 |
| 0.7715277777777777 | 0 |
| 0.7722222222222223 | 0 |
| 0.7729166666666667 | 0 |
| 0.7736111111111111 | 0 |
| 0.7743055555555555 | 0 |
| 0.775 | 0 |
| 0.7756944444444445 | 0 |
| 0.7763888888888889 | 0 |
| 0.7770833333333332 | 0 |
| 0.7777777777777778 | 0 |
| 0.7784722222222222 | 0 |
| 0.7791666666666667 | 0 |
| 0.779861111111111 | 0 |
| 0.7805555555555556 | 0 |
| 0.78125 | 0 |
| 0.7819444444444444 | 0 |
| 0.782638888888889 | 0 |
| 0.7833333333333333 | 0 |
| 0.7840277777777778 | 0 |
| 0.7847222222222222 | 0 |
| 0.7854166666666668 | 0 |
| 0.7861111111111111 | 0 |
| 0.7868055555555555 | 0 |
| 0.7875 | 0 |
| 0.7881944444444445 | 0 |
| 0.7888888888888889 | 0 |
| 0.7895833333333333 | 0 |
| 0.7902777777777777 | 0 |
| 0.7909722222222223 | 0 |
| 0.7916666666666666 | 0 |
| 0.7923611111111111 | 0 |
| 0.7930555555555556 | 0 |
| 0.7937500000000001 | 0 |
| 0.7944444444444444 | 0 |
| 0.7951388888888888 | 0 |
| 0.7958333333333334 | 0 |
| 0.7965277777777778 | 0 |
| 0.7972222222222222 | 0 |
| 0.7979166666666666 | 0 |
| 0.7986111111111112 | 0 |
| 0.7993055555555556 | 0 |
| 0.7999999999999999 | 0 |
| 0.8006944444444444 | 0 |
| 0.8013888888888889 | 0 |
| 0.8020833333333334 | 0 |
| 0.8027777777777777 | 0 |
| 0.8034722222222223 | 0 |
| 0.8041666666666667 | 0 |
| 0.8048611111111111 | 0 |
| 0.8055555555555555 | 0 |
| 0.80625 | 0 |
| 0.8069444444444445 | 0 |
| 0.8076388888888889 | 0 |
| 0.8083333333333332 | 0 |
| 0.8090277777777778 | 0 |
| 0.8097222222222222 | 0 |
| 0.8104166666666667 | 0 |
| 0.811111111111111 | 0 |
| 0.8118055555555556 | 0 |
| 0.8125 | 0 |
| 0.8131944444444444 | 0 |
| 0.813888888888889 | 0 |
| 0.8145833333333333 | 0 |
| 0.8152777777777778 | 0 |
| 0.8159722222222222 | 0 |
| 0.8166666666666668 | 0 |
| 0.8173611111111111 | 0 |
| 0.8180555555555555 | 0 |
| 0.81875 | 0 |
| 0.8194444444444445 | 0 |
| 0.8201388888888889 | 0 |
| 0.8208333333333333 | 0 |
| 0.8215277777777777 | 0 |
| 0.8222222222222223 | 0 |
| 0.8229166666666666 | 0 |
| 0.8236111111111111 | 0 |
| 0.8243055555555556 | 0 |
| 0.8250000000000001 | 0 |
| 0.8256944444444444 | 0 |
| 0.8263888888888888 | 0 |
| 0.8270833333333334 | 0 |
| 0.8277777777777778 | 0 |
| 0.8284722222222222 | 0 |
| 0.8291666666666666 | 0 |
| 0.8298611111111112 | 0 |
| 0.8305555555555556 | 0 |
| 0.8312499999999999 | 0 |
| 0.8319444444444444 | 0 |
| 0.8326388888888889 | 0 |
| 0.8333333333333334 | 0 |
| 0.8340277777777777 | 0 |
| 0.8347222222222223 | 0 |
| 0.8354166666666667 | 0 |
| 0.8361111111111111 | 0 |
| 0.8368055555555555 | 0 |
| 0.8375 | 0 |
| 0.8381944444444445 | 0 |
| 0.8388888888888889 | 0 |
| 0.8395833333333332 | 0 |
| 0.8402777777777778 | 0 |
| 0.8409722222222222 | 0 |
| 0.8416666666666667 | 0 |
| 0.842361111111111 | 0 |
| 0.8430555555555556 | 0 |
| 0.84375 | 0 |
| 0.8444444444444444 | 0 |
| 0.845138888888889 | 0 |
| 0.8458333333333333 | 0 |
| 0.8465277777777778 | 0 |
| 0.8472222222222222 | 0 |
| 0.8479166666666668 | 0 |
| 0.8486111111111111 | 0 |
| 0.8493055555555555 | 0 |
| 0.85 | 0 |
| 0.8506944444444445 | 0 |
| 0.8513888888888889 | 0 |
| 0.8520833333333333 | 0 |
| 0.8527777777777777 | 0 |
| 0.8534722222222223 | 0 |
| 0.8541666666666666 | 0 |
| 0.8548611111111111 | 0 |
| 0.8555555555555556 | 0 |
| 0.8562500000000001 | 0 |
| 0.8569444444444444 | 0 |
| 0.8576388888888888 | 0 |
| 0.8583333333333334 | 0 |
| 0.8590277777777778 | 0 |
| 0.8597222222222222 | 0 |
| 0.8604166666666666 | 0 |
| 0.8611111111111112 | 0 |
| 0.8618055555555556 | 0 |
| 0.8624999999999999 | 0 |
| 0.8631944444444444 | 0 |
| 0.8638888888888889 | 0 |
| 0.8645833333333334 | 0 |
| 0.8652777777777777 | 0 |
| 0.8659722222222223 | 0 |
| 0.8666666666666667 | 0 |
| 0.8673611111111111 | 0 |
| 0.8680555555555555 | 0 |
| 0.86875 | 0 |
| 0.8694444444444445 | 0 |
| 0.8701388888888889 | 0 |
| 0.8708333333333332 | 0 |
| 0.8715277777777778 | 0 |
| 0.8722222222222222 | 0 |
| 0.8729166666666667 | 0 |
| 0.873611111111111 | 0 |
| 0.8743055555555556 | 0 |
| 0.875 | 0 |
| 0.8756944444444444 | 0 |
| 0.876388888888889 | 0 |
| 0.8770833333333333 | 0 |
| 0.8777777777777778 | 0 |
| 0.8784722222222222 | 0 |
| 0.8791666666666668 | 0 |
| 0.8798611111111111 | 0 |
| 0.8805555555555555 | 0 |
| 0.88125 | 0 |
| 0.8819444444444445 | 0 |
| 0.8826388888888889 | 0 |
| 0.8833333333333333 | 0 |
| 0.8840277777777777 | 0 |
| 0.8847222222222223 | 0 |
| 0.8854166666666666 | 0 |
| 0.8861111111111111 | 0 |
| 0.8868055555555556 | 0 |
| 0.8875000000000001 | 0 |
| 0.8881944444444444 | 0 |
| 0.8888888888888888 | 0 |
| 0.8895833333333334 | 0 |
| 0.8902777777777778 | 0 |
| 0.8909722222222222 | 0 |
| 0.8916666666666666 | 0 |
| 0.8923611111111112 | 0 |
| 0.8930555555555556 | 0 |
| 0.8937499999999999 | 0 |
| 0.8944444444444444 | 0 |
| 0.8951388888888889 | 0 |
| 0.8958333333333334 | 0 |
| 0.8965277777777777 | 0 |
| 0.8972222222222223 | 0 |
| 0.8979166666666667 | 0 |
| 0.8986111111111111 | 0 |
| 0.8993055555555555 | 0 |
| 0.9 | 0 |
| 0.9006944444444445 | 0 |
| 0.9013888888888889 | 0 |
| 0.9020833333333332 | 0 |
| 0.9027777777777778 | 0 |
| 0.9034722222222222 | 0 |
| 0.9041666666666667 | 0 |
| 0.904861111111111 | 0 |
| 0.9055555555555556 | 0 |
| 0.90625 | 0 |
| 0.9069444444444444 | 0 |
| 0.907638888888889 | 0 |
| 0.9083333333333333 | 0 |
| 0.9090277777777778 | 0 |
| 0.9097222222222222 | 0 |
| 0.9104166666666668 | 0 |
| 0.9111111111111111 | 0 |
| 0.9118055555555555 | 0 |
| 0.9125 | 0 |
| 0.9131944444444445 | 0 |
| 0.9138888888888889 | 0 |
| 0.9145833333333333 | 0 |
| 0.9152777777777777 | 0 |
| 0.9159722222222223 | 0 |
| 0.9166666666666666 | 0 |
| 0.9173611111111111 | 0 |
| 0.9180555555555556 | 0 |
| 0.9187500000000001 | 0 |
| 0.9194444444444444 | 0 |
| 0.9201388888888888 | 0 |
| 0.9208333333333334 | 0 |
| 0.9215277777777778 | 0 |
| 0.9222222222222222 | 0 |
| 0.9229166666666666 | 0 |
| 0.9236111111111112 | 0 |
| 0.9243055555555556 | 0 |
| 0.9249999999999999 | 0 |
| 0.9256944444444444 | 0 |
| 0.9263888888888889 | 0 |
| 0.9270833333333334 | 0 |
| 0.9277777777777777 | 0 |
| 0.9284722222222223 | 0 |
| 0.9291666666666667 | 0 |
| 0.9298611111111111 | 0 |
| 0.9305555555555555 | 0 |
| 0.93125 | 0 |
| 0.9319444444444445 | 0 |
| 0.9326388888888889 | 0 |
| 0.9333333333333332 | 0 |
| 0.9340277777777778 | 0 |
| 0.9347222222222222 | 0 |
| 0.9354166666666667 | 0 |
| 0.936111111111111 | 0 |
| 0.9368055555555556 | 0 |
| 0.9375 | 0 |
| 0.9381944444444444 | 0 |
| 0.938888888888889 | 0 |
| 0.9395833333333333 | 0 |
| 0.9402777777777778 | 0 |
| 0.9409722222222222 | 0 |
| 0.9416666666666668 | 0 |
| 0.9423611111111111 | 0 |
| 0.9430555555555555 | 0 |
| 0.94375 | 0 |
| 0.9444444444444445 | 0 |
| 0.9451388888888889 | 0 |
| 0.9458333333333333 | 0 |
| 0.9465277777777777 | 0 |
| 0.9472222222222223 | 0 |
| 0.9479166666666666 | 0 |
| 0.9486111111111111 | 0 |
| 0.9493055555555556 | 0 |
| 0.9500000000000001 | 0 |
| 0.9506944444444444 | 0 |
| 0.9513888888888888 | 0 |
| 0.9520833333333334 | 0 |
| 0.9527777777777778 | 0 |
| 0.9534722222222222 | 0 |
| 0.9541666666666666 | 0 |
| 0.9548611111111112 | 0 |
| 0.9555555555555556 | 0 |
| 0.9562499999999999 | 0 |
| 0.9569444444444444 | 0 |
| 0.9576388888888889 | 0 |
| 0.9583333333333334 | 0 |
| 0.9590277777777777 | 0 |
| 0.9597222222222223 | 0 |
| 0.9604166666666667 | 0 |
| 0.9611111111111111 | 0 |
| 0.9618055555555555 | 0 |
| 0.9625 | 0 |
| 0.9631944444444445 | 0 |
| 0.9638888888888889 | 0 |
| 0.9645833333333332 | 0 |
| 0.9652777777777778 | 0 |
| 0.9659722222222222 | 0 |
| 0.9666666666666667 | 0 |
| 0.967361111111111 | 0 |
| 0.9680555555555556 | 0 |
| 0.96875 | 0 |
| 0.9694444444444444 | 0 |
| 0.970138888888889 | 0 |
| 0.9708333333333333 | 0 |
| 0.9715277777777778 | 0 |
| 0.9722222222222222 | 0 |
| 0.9729166666666668 | 0 |
| 0.9736111111111111 | 0 |
| 0.9743055555555555 | 0 |
| 0.975 | 0 |
| 0.9756944444444445 | 0 |
| 0.9763888888888889 | 0 |
| 0.9770833333333333 | 0 |
| 0.9777777777777777 | 0 |
| 0.9784722222222223 | 0 |
| 0.9791666666666666 | 0 |
| 0.9798611111111111 | 0 |
| 0.9805555555555556 | 0 |
| 0.9812500000000001 | 0 |
| 0.9819444444444444 | 0 |
| 0.9826388888888888 | 0 |
| 0.9833333333333334 | 0 |
| 0.9840277777777778 | 0 |
| 0.9847222222222222 | 0 |
| 0.9854166666666666 | 0 |
| 0.9861111111111112 | 0 |
| 0.9868055555555556 | 0 |
| 0.9874999999999999 | 0 |
| 0.9881944444444444 | 0 |
| 0.9888888888888889 | 0 |
| 0.9895833333333334 | 0 |
| 0.9902777777777777 | 0 |
| 0.9909722222222223 | 0 |
| 0.9916666666666667 | 0 |
| 0.9923611111111111 | 0 |
| 0.9930555555555555 | 0 |
| 0.99375 | 0 |
| 0.9944444444444445 | 0 |
| 0.9951388888888889 | 0 |
| 0.9958333333333332 | 0 |
| 0.9965277777777778 | 0 |
| 0.9972222222222222 | 0 |
| 0.9979166666666667 | 0 |
| 0.998611111111111 | 0 |
| 0.9993055555555556 | 0 |